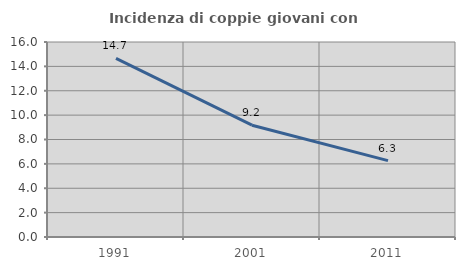
| Category | Incidenza di coppie giovani con figli |
|---|---|
| 1991.0 | 14.654 |
| 2001.0 | 9.173 |
| 2011.0 | 6.264 |